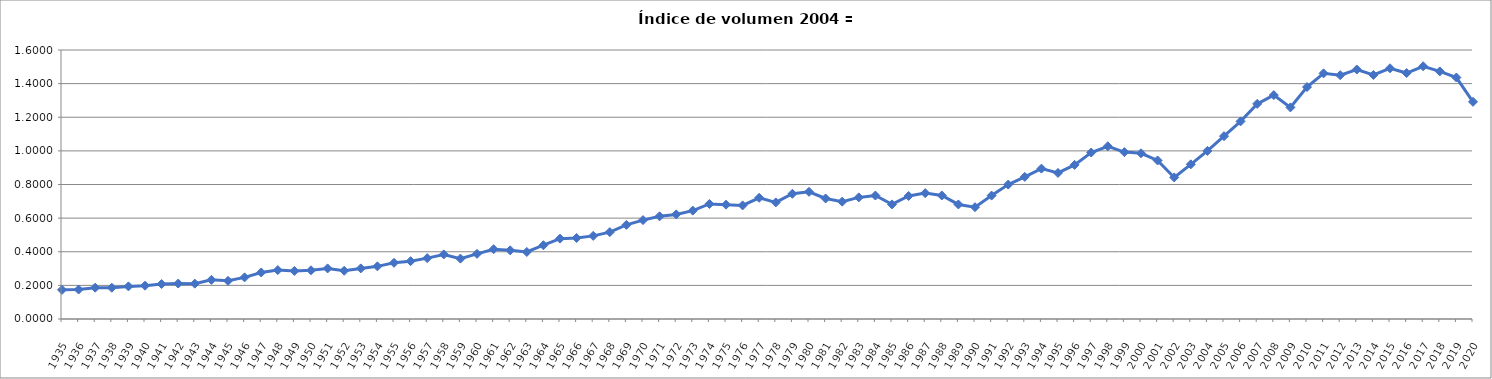
| Category | Índice de volumen 2004 = 1 |
|---|---|
| 1935.0 | 0.173 |
| 1936.0 | 0.175 |
| 1937.0 | 0.186 |
| 1938.0 | 0.186 |
| 1939.0 | 0.194 |
| 1940.0 | 0.198 |
| 1941.0 | 0.208 |
| 1942.0 | 0.211 |
| 1943.0 | 0.21 |
| 1944.0 | 0.233 |
| 1945.0 | 0.227 |
| 1946.0 | 0.248 |
| 1947.0 | 0.277 |
| 1948.0 | 0.291 |
| 1949.0 | 0.286 |
| 1950.0 | 0.29 |
| 1951.0 | 0.301 |
| 1952.0 | 0.287 |
| 1953.0 | 0.301 |
| 1954.0 | 0.313 |
| 1955.0 | 0.334 |
| 1956.0 | 0.344 |
| 1957.0 | 0.362 |
| 1958.0 | 0.384 |
| 1959.0 | 0.359 |
| 1960.0 | 0.388 |
| 1961.0 | 0.415 |
| 1962.0 | 0.408 |
| 1963.0 | 0.399 |
| 1964.0 | 0.439 |
| 1965.0 | 0.478 |
| 1966.0 | 0.482 |
| 1967.0 | 0.494 |
| 1968.0 | 0.517 |
| 1969.0 | 0.56 |
| 1970.0 | 0.588 |
| 1971.0 | 0.611 |
| 1972.0 | 0.622 |
| 1973.0 | 0.645 |
| 1974.0 | 0.684 |
| 1975.0 | 0.68 |
| 1976.0 | 0.676 |
| 1977.0 | 0.721 |
| 1978.0 | 0.693 |
| 1979.0 | 0.745 |
| 1980.0 | 0.757 |
| 1981.0 | 0.717 |
| 1982.0 | 0.698 |
| 1983.0 | 0.723 |
| 1984.0 | 0.734 |
| 1985.0 | 0.682 |
| 1986.0 | 0.732 |
| 1987.0 | 0.749 |
| 1988.0 | 0.735 |
| 1989.0 | 0.681 |
| 1990.0 | 0.665 |
| 1991.0 | 0.734 |
| 1992.0 | 0.799 |
| 1993.0 | 0.845 |
| 1994.0 | 0.894 |
| 1995.0 | 0.869 |
| 1996.0 | 0.917 |
| 1997.0 | 0.99 |
| 1998.0 | 1.027 |
| 1999.0 | 0.993 |
| 2000.0 | 0.986 |
| 2001.0 | 0.943 |
| 2002.0 | 0.842 |
| 2003.0 | 0.92 |
| 2004.0 | 1 |
| 2005.0 | 1.088 |
| 2006.0 | 1.175 |
| 2007.0 | 1.28 |
| 2008.0 | 1.332 |
| 2009.0 | 1.259 |
| 2010.0 | 1.38 |
| 2011.0 | 1.461 |
| 2012.0 | 1.45 |
| 2013.0 | 1.484 |
| 2014.0 | 1.451 |
| 2015.0 | 1.491 |
| 2016.0 | 1.463 |
| 2017.0 | 1.503 |
| 2018.0 | 1.473 |
| 2019.0 | 1.436 |
| 2020.0 | 1.292 |